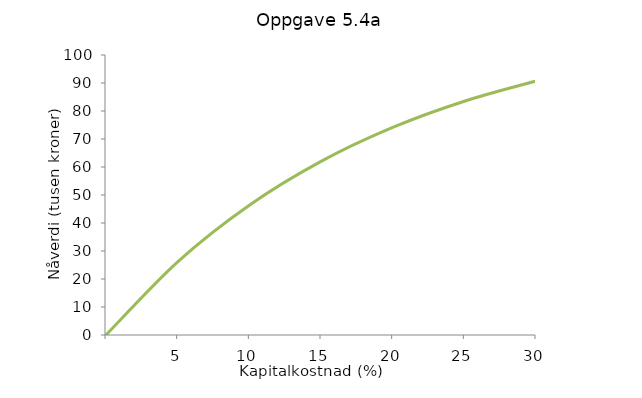
| Category | Saldosats 30 % | Saldosats 20 % | Differansekontantstrøm |
|---|---|---|---|
| nan |  |  | 0 |
| 5.0 |  |  | 26.125 |
| 10.0 |  |  | 46.334 |
| 15.000000000000002 |  |  | 61.992 |
| 20.0 |  |  | 74.12 |
| 25.0 |  |  | 83.488 |
| 30.0 |  |  | 90.683 |